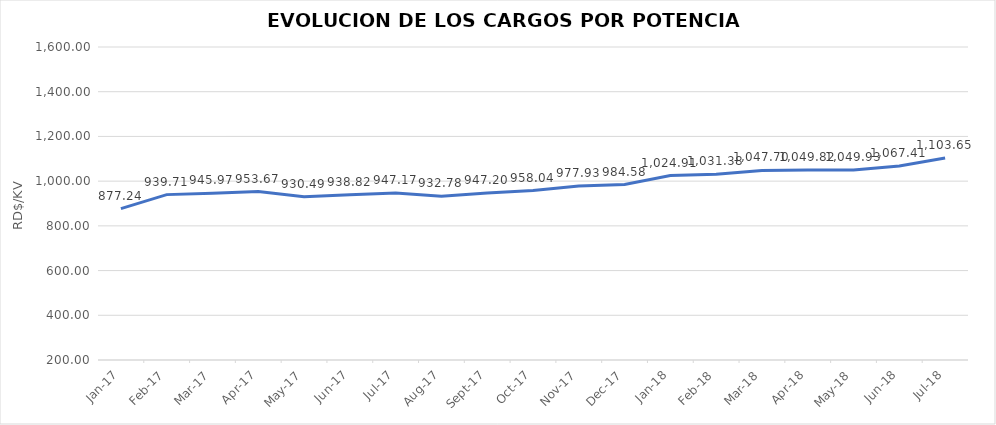
| Category | Series 0 |
|---|---|
| 2017-01-01 | 877.236 |
| 2017-02-01 | 939.71 |
| 2017-03-01 | 945.975 |
| 2017-04-01 | 953.67 |
| 2017-05-01 | 930.49 |
| 2017-06-01 | 938.816 |
| 2017-07-01 | 947.169 |
| 2017-08-01 | 932.783 |
| 2017-09-01 | 947.198 |
| 2017-10-01 | 958.035 |
| 2017-11-01 | 977.934 |
| 2017-12-01 | 984.584 |
| 2018-01-01 | 1024.909 |
| 2018-02-01 | 1031.38 |
| 2018-03-01 | 1047.702 |
| 2018-04-01 | 1049.816 |
| 2018-05-01 | 1049.93 |
| 2018-06-01 | 1067.413 |
| 2018-07-01 | 1103.655 |